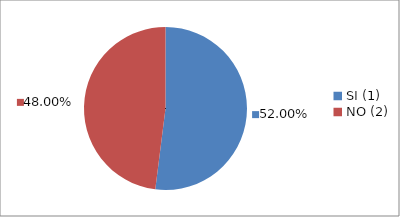
| Category | Series 0 |
|---|---|
| SI (1) | 0.52 |
| NO (2) | 0.48 |